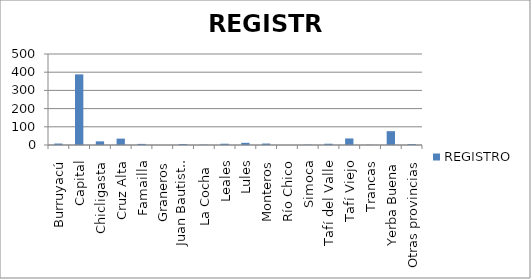
| Category | REGISTRO |
|---|---|
| Burruyacú | 8 |
| Capital | 388 |
| Chicligasta | 20 |
| Cruz Alta | 35 |
| Famailla | 6 |
| Graneros | 0 |
| Juan Bautista Alberdi | 5 |
| La Cocha  | 2 |
| Leales | 7 |
| Lules | 12 |
| Monteros | 8 |
| Río Chico | 0 |
| Simoca | 2 |
| Tafí del Valle | 7 |
| Tafí Viejo | 36 |
| Trancas | 1 |
| Yerba Buena | 76 |
| Otras provincias | 5 |